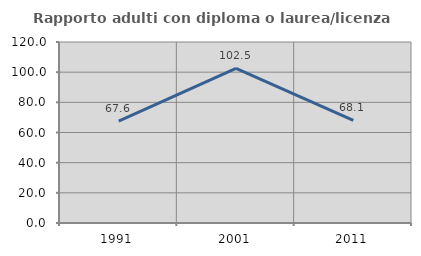
| Category | Rapporto adulti con diploma o laurea/licenza media  |
|---|---|
| 1991.0 | 67.568 |
| 2001.0 | 102.5 |
| 2011.0 | 68.085 |